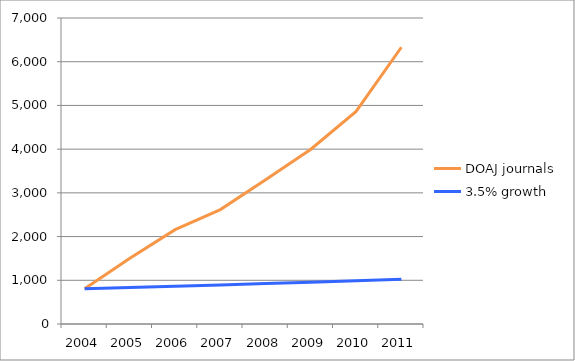
| Category | DOAJ journals | 3.5% growth |
|---|---|---|
| 2004.0 | 806 | 806 |
| 2005.0 | 1503 | 834.21 |
| 2006.0 | 2158 | 863.407 |
| 2007.0 | 2618 | 893.627 |
| 2008.0 | 3302 | 924.904 |
| 2009.0 | 3999 | 957.275 |
| 2010.0 | 4863 | 990.78 |
| 2011.0 | 6331 | 1025.457 |